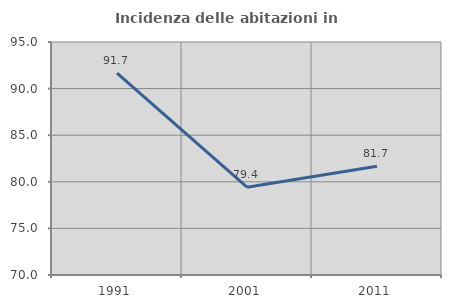
| Category | Incidenza delle abitazioni in proprietà  |
|---|---|
| 1991.0 | 91.667 |
| 2001.0 | 79.421 |
| 2011.0 | 81.672 |